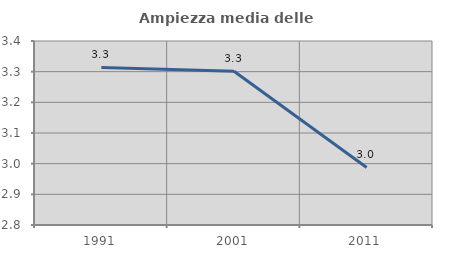
| Category | Ampiezza media delle famiglie |
|---|---|
| 1991.0 | 3.314 |
| 2001.0 | 3.301 |
| 2011.0 | 2.988 |